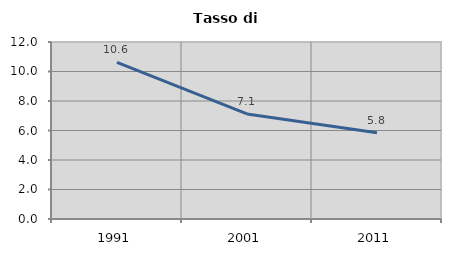
| Category | Tasso di disoccupazione   |
|---|---|
| 1991.0 | 10.624 |
| 2001.0 | 7.125 |
| 2011.0 | 5.841 |